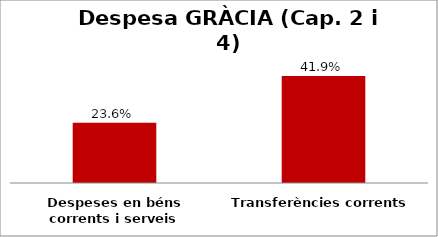
| Category | Series 0 |
|---|---|
| Despeses en béns corrents i serveis | 0.236 |
| Transferències corrents | 0.419 |